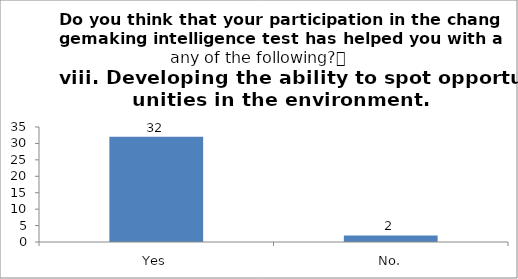
| Category | Do you think that your participation in the changemaking intelligence test has helped you with any of the following?
viii. Developing the ability to spot opportunities in the environment. |
|---|---|
| Yes | 32 |
| No. | 2 |